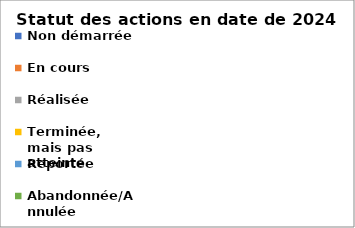
| Category | 2024 |
|---|---|
| Non démarrée | 0 |
| En cours | 0 |
| Réalisée | 0 |
| Terminée, mais pas atteinte | 0 |
| Reportée | 0 |
| Abandonnée/Annulée | 0 |